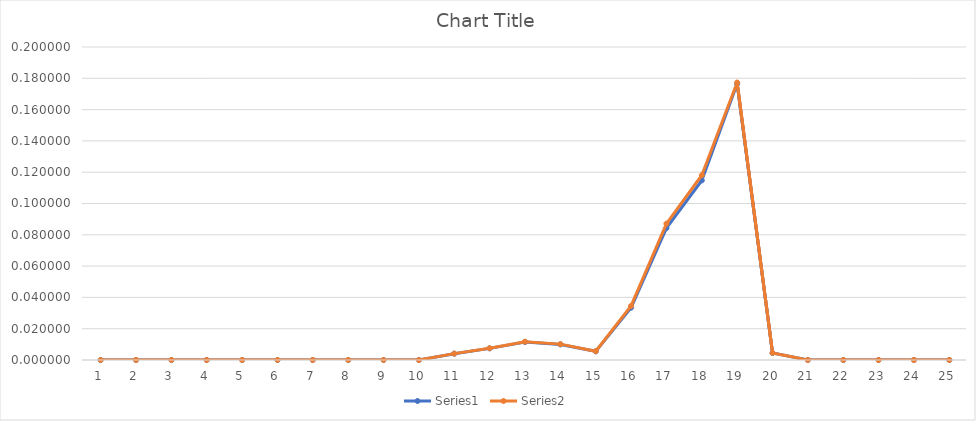
| Category | Series 0 | Series 1 |
|---|---|---|
| 0 | 0 | 0 |
| 1 | 0 | 0 |
| 2 | 0 | 0 |
| 3 | 0 | 0 |
| 4 | 0 | 0 |
| 5 | 0 | 0 |
| 6 | 0 | 0 |
| 7 | 0 | 0 |
| 8 | 0 | 0 |
| 9 | 0 | 0 |
| 10 | 0.004 | 0.004 |
| 11 | 0.007 | 0.008 |
| 12 | 0.011 | 0.012 |
| 13 | 0.01 | 0.01 |
| 14 | 0.006 | 0.006 |
| 15 | 0.033 | 0.035 |
| 16 | 0.084 | 0.087 |
| 17 | 0.115 | 0.118 |
| 18 | 0.176 | 0.177 |
| 19 | 0.004 | 0.005 |
| 20 | 0 | 0 |
| 21 | 0 | 0 |
| 22 | 0 | 0 |
| 23 | 0 | 0 |
| 24 | 0 | 0 |